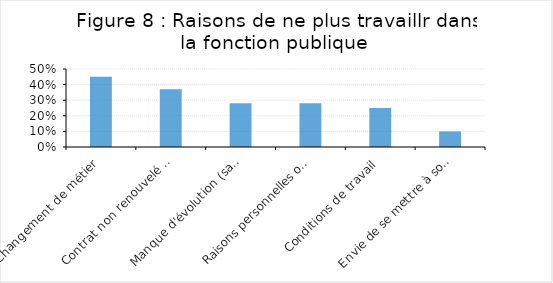
| Category | A travaillé au moins une fois dans la fonction publique |
|---|---|
| Changement de métier | 0.45 |
| Contrat non renouvelé ou échec à un concours | 0.37 |
| Manque d'évolution (salariale, professionnelle, etc.) | 0.28 |
| Raisons personnelles ou familiales | 0.28 |
| Conditions de travail | 0.25 |
| Envie de se mettre à son compte | 0.1 |